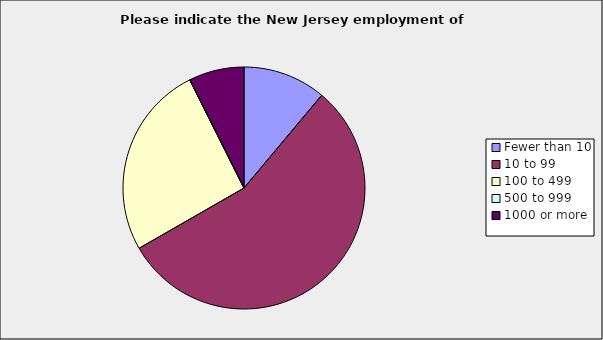
| Category | Series 0 |
|---|---|
| Fewer than 10 | 0.111 |
| 10 to 99 | 0.556 |
| 100 to 499 | 0.259 |
| 500 to 999 | 0 |
| 1000 or more | 0.074 |